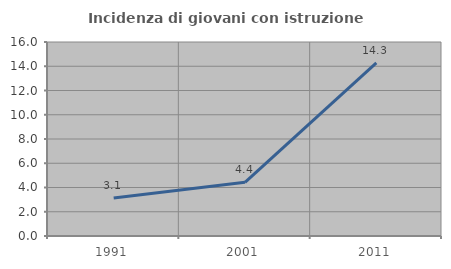
| Category | Incidenza di giovani con istruzione universitaria |
|---|---|
| 1991.0 | 3.125 |
| 2001.0 | 4.425 |
| 2011.0 | 14.286 |